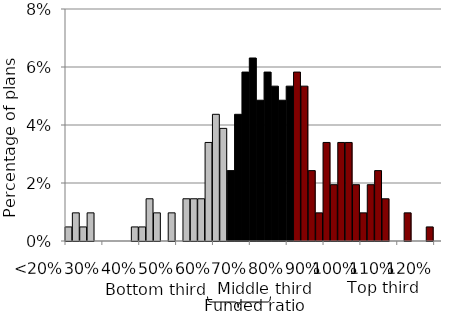
| Category | Series 0 |
|---|---|
| <20% | 0.005 |
|  | 0.01 |
|  | 0.005 |
|  | 0.01 |
|  | 0 |
| 30% | 0 |
|  | 0 |
|  | 0 |
|  | 0 |
|  | 0.005 |
| 40% | 0.005 |
|  | 0.015 |
|  | 0.01 |
|  | 0 |
|  | 0.01 |
| 50% | 0 |
|  | 0.015 |
|  | 0.015 |
|  | 0.015 |
|  | 0.034 |
| 60% | 0.044 |
|  | 0.039 |
|  | 0.024 |
|  | 0.044 |
|  | 0.058 |
| 70% | 0.063 |
|  | 0.049 |
|  | 0.058 |
|  | 0.053 |
|  | 0.049 |
| 80% | 0.053 |
|  | 0.058 |
|  | 0.053 |
|  | 0.024 |
|  | 0.01 |
| 90% | 0.034 |
|  | 0.019 |
|  | 0.034 |
|  | 0.034 |
|  | 0.019 |
| 100% | 0.01 |
|  | 0.019 |
|  | 0.024 |
|  | 0.015 |
|  | 0 |
| 110% | 0 |
|  | 0.01 |
|  | 0 |
|  | 0 |
|  | 0.005 |
| 120% | 0 |